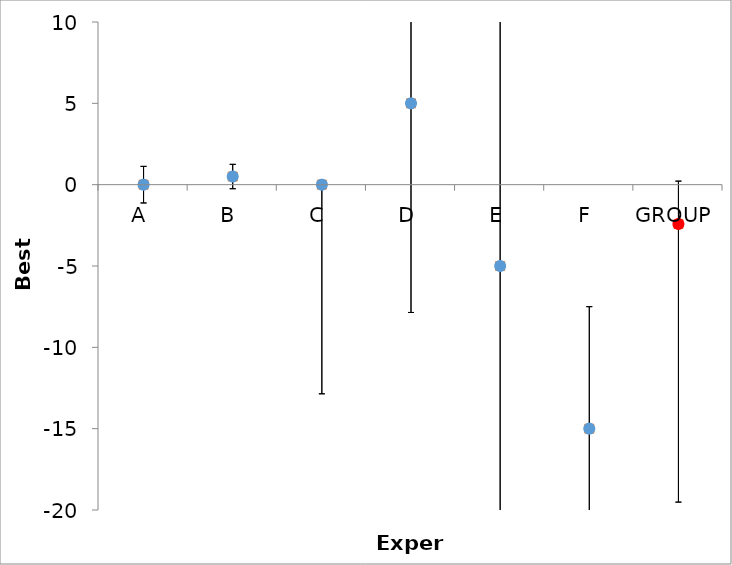
| Category | Series 1 | Series 0 |
|---|---|---|
| A | 0 | 0 |
| B | 0.5 | 0.5 |
| C | 0 | 0 |
| D | 5 | 5 |
| E | -5 | -5 |
| F | -15 | -15 |
| GROUP | -2.417 | -2.417 |